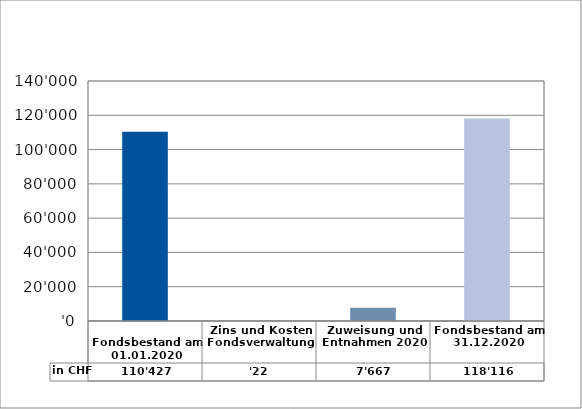
| Category | in CHF |
|---|---|
| 
Fondsbestand am 01.01.2020

 | 110427 |
| Zins und Kosten Fondsverwaltung | 22.1 |
| Zuweisung und Entnahmen 2020 | 7667.3 |
| Fondsbestand am 31.12.2020 | 118116.4 |